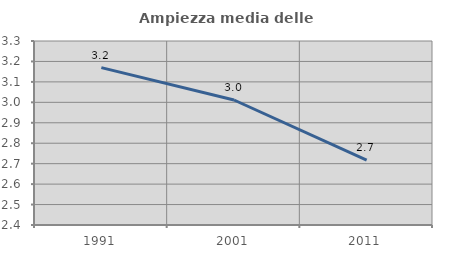
| Category | Ampiezza media delle famiglie |
|---|---|
| 1991.0 | 3.17 |
| 2001.0 | 3.011 |
| 2011.0 | 2.717 |